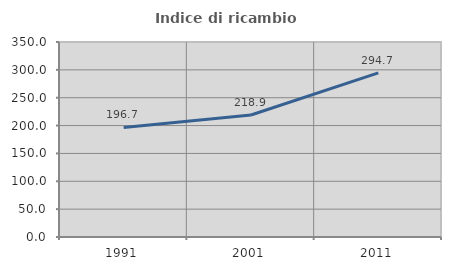
| Category | Indice di ricambio occupazionale  |
|---|---|
| 1991.0 | 196.739 |
| 2001.0 | 218.889 |
| 2011.0 | 294.681 |